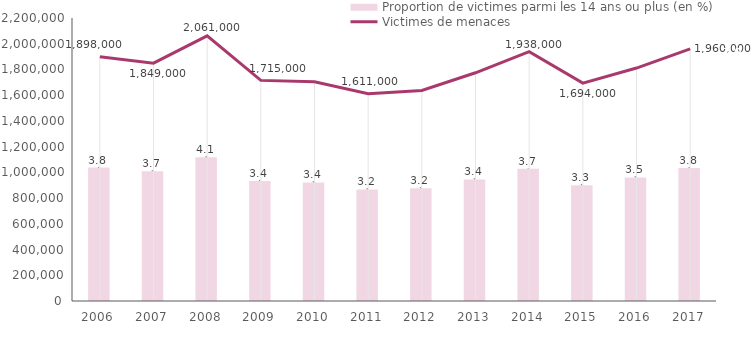
| Category | Proportion de victimes parmi les 14 ans ou plus (en %) |
|---|---|
| 2006.0 | 3.771 |
| 2007.0 | 3.67 |
| 2008.0 | 4.06 |
| 2009.0 | 3.391 |
| 2010.0 | 3.351 |
| 2011.0 | 3.153 |
| 2012.0 | 3.188 |
| 2013.0 | 3.438 |
| 2014.0 | 3.742 |
| 2015.0 | 3.272 |
| 2016.0 | 3.494 |
| 2017.0 | 3.756 |